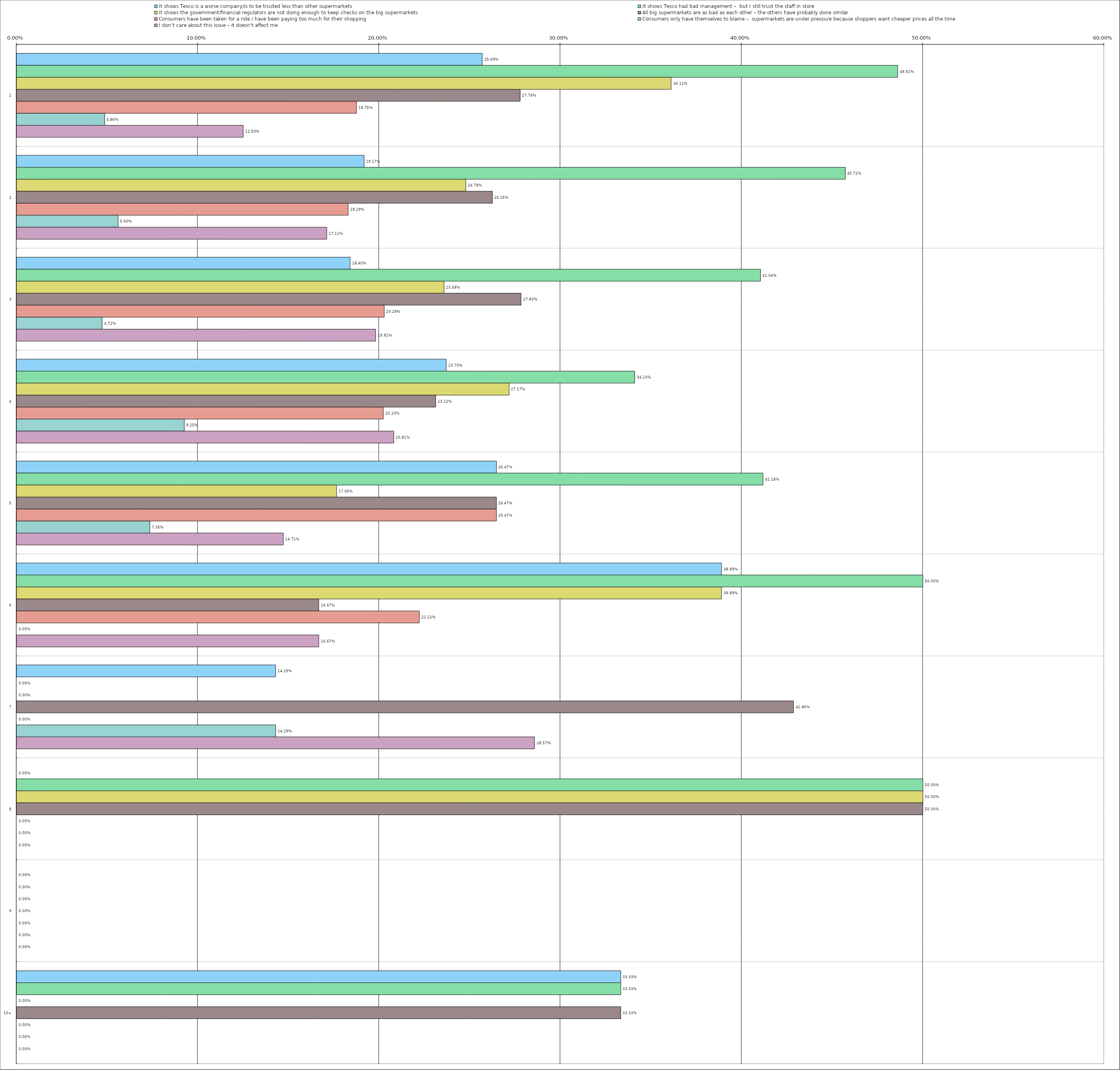
| Category | It shows Tesco is a worse company/is to be trusted less than other supermarkets | It shows Tesco had bad management –  but I still trust the staff in store | It shows the government/financial regulators are not doing enough to keep checks on the big supermarkets | All big supermarkets are as bad as each other – the others have probably done similar | Consumers have been taken for a ride / have been paying too much for their shopping | Consumers only have themselves to blame –  supermarkets are under pressure because shoppers want cheaper prices all the time | I don’t care about this issue – it doesn't affect me |
|---|---|---|---|---|---|---|---|
| 0 | 0.257 | 0.486 | 0.361 | 0.278 | 0.188 | 0.049 | 0.125 |
| 1 | 0.192 | 0.457 | 0.248 | 0.262 | 0.183 | 0.056 | 0.171 |
| 2 | 0.184 | 0.41 | 0.236 | 0.278 | 0.203 | 0.047 | 0.198 |
| 3 | 0.237 | 0.341 | 0.272 | 0.231 | 0.202 | 0.092 | 0.208 |
| 4 | 0.265 | 0.412 | 0.176 | 0.265 | 0.265 | 0.074 | 0.147 |
| 5 | 0.389 | 0.5 | 0.389 | 0.167 | 0.222 | 0 | 0.167 |
| 6 | 0.143 | 0 | 0 | 0.429 | 0 | 0.143 | 0.286 |
| 7 | 0 | 0.5 | 0.5 | 0.5 | 0 | 0 | 0 |
| 8 | 0 | 0 | 0 | 0 | 0 | 0 | 0 |
| 9 | 0.333 | 0.333 | 0 | 0.333 | 0 | 0 | 0 |